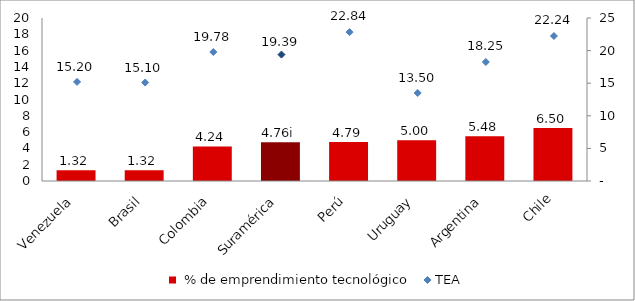
| Category | % de emprendimiento tecnológico |
|---|---|
| Venezuela | 1.316 |
| Brasil | 1.325 |
| Colombia | 4.24 |
| Suramérica | 4.756 |
| Perú | 4.793 |
| Uruguay | 5 |
| Argentina | 5.479 |
| Chile | 6.5 |